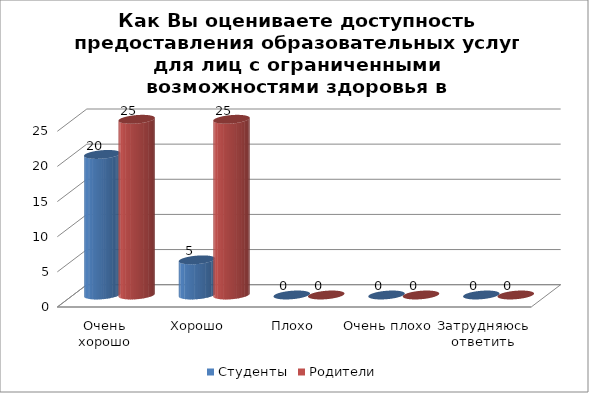
| Category | Студенты | Родители |
|---|---|---|
| Очень хорошо | 20 | 25 |
| Хорошо | 5 | 25 |
| Плохо | 0 | 0 |
| Очень плохо | 0 | 0 |
| Затрудняюсь ответить | 0 | 0 |